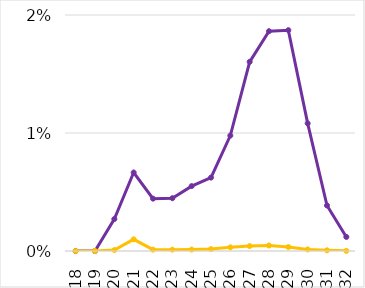
| Category | TE | Virus |
|---|---|---|
| 18.0 | 0 | 0 |
| 19.0 | 0 | 0 |
| 20.0 | 0.003 | 0 |
| 21.0 | 0.007 | 0.001 |
| 22.0 | 0.004 | 0 |
| 23.0 | 0.004 | 0 |
| 24.0 | 0.005 | 0 |
| 25.0 | 0.006 | 0 |
| 26.0 | 0.01 | 0 |
| 27.0 | 0.016 | 0 |
| 28.0 | 0.019 | 0 |
| 29.0 | 0.019 | 0 |
| 30.0 | 0.011 | 0 |
| 31.0 | 0.004 | 0 |
| 32.0 | 0.001 | 0 |